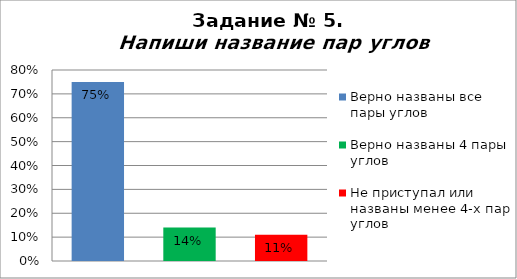
| Category | Series 0 |
|---|---|
| Верно названы все пары углов | 0.75 |
| Верно названы 4 пары углов | 0.14 |
| Не приступал или названы менее 4-х пар углов | 0.11 |